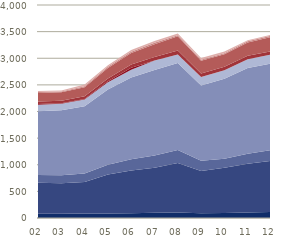
| Category | Landbrug, skovbrug og fiskeri | Industri, råstof og forsyning | Bygge og anlæg | Handel og transport mv. | Information og komm. | Finansiering og forsikring | Ejendomshandel og udl. | Erhvervs-service | Off. adm., undervisn. 
og sundhed | Kultur, fritid mv. |
|---|---|---|---|---|---|---|---|---|---|---|
| 02 | 81.99 | 578.836 | 148.858 | 1196.19 | 121.625 | 11.984 | 50.278 | 158.414 | 17.568 | 18.654 |
| 03 | 79.083 | 574.688 | 150.684 | 1217.878 | 122.659 | 9.445 | 48.677 | 156.1 | 14.713 | 18.598 |
| 04 | 83.034 | 591.167 | 160.338 | 1263.686 | 127.428 | 9.37 | 50.198 | 170.524 | 19.856 | 32.107 |
| 05 | 86.836 | 730.266 | 181.924 | 1412.89 | 137.15 | 16.689 | 55.919 | 195.66 | 21.5 | 31.575 |
| 06 | 90.848 | 803.105 | 210.547 | 1535.142 | 142.821 | 39.696 | 61.08 | 217.082 | 22.986 | 31.674 |
| 07 | 97.272 | 844.539 | 234.092 | 1604.597 | 175.095 | 0 | 67.048 | 241.684 | 27.189 | 33.125 |
| 08 | 103.508 | 930.971 | 241.077 | 1634.295 | 161.758 | 0 | 75.468 | 266.351 | 18.236 | 33.371 |
| 09 | 89.781 | 794.082 | 190.42 | 1415.569 | 159.231 | 0 | 62.341 | 242.118 | 19.154 | 31.84 |
| 10 | 96.217 | 846.935 | 169.311 | 1500.94 | 162.628 | 0 | 62.427 | 237.895 | 19.786 | 31.98 |
| 11 | 102.414 | 915.054 | 188.829 | 1611.976 | 165.178 | 0 | 64.204 | 250.226 | 20.061 | 20.192 |
| 12 | 110.73 | 963.39 | 201.2 | 1626.781 | 165.411 | 0 | 63.578 | 269.047 | 22.415 | 20.898 |